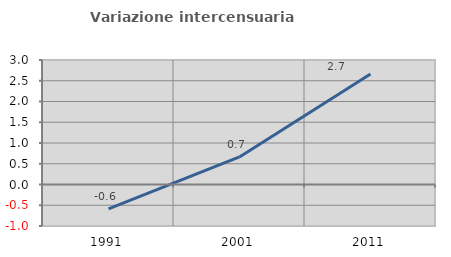
| Category | Variazione intercensuaria annua |
|---|---|
| 1991.0 | -0.587 |
| 2001.0 | 0.665 |
| 2011.0 | 2.664 |